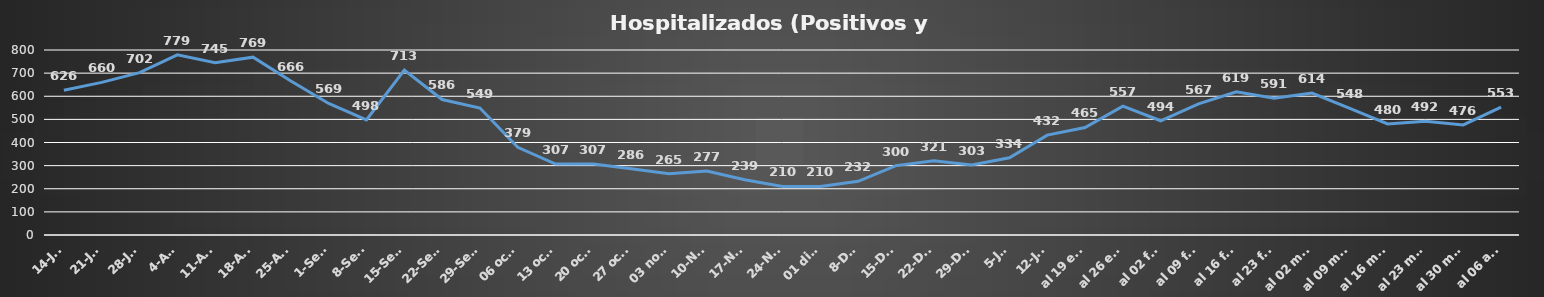
| Category | Series 0 |
|---|---|
| 14-Jul | 626 |
| 21-Jul | 660 |
| 28-Jul | 702 |
| 4-Ago | 779 |
| 11-Ago | 745 |
| 18-Ago | 769 |
| 25-Ago | 666 |
| 1-Set | 569 |
| 8-Set | 498 |
| 15-Set | 713 |
| 22-Set | 586 |
| 29-Set | 549 |
| 06 oct. | 379 |
| 13 oct. | 307 |
| 20 oct. | 307 |
| 27 oct. | 286 |
| 03 nov. | 265 |
| 10-Nov | 277 |
| 17-Nov | 239 |
| 24-Nov | 210 |
|  01 dic. | 210 |
| 8-Dic | 232 |
| 15-Dic | 300 |
| 22-Dic | 321 |
| 29-Dic | 303 |
| 5-Ene | 334 |
| 12-Ene | 432 |
| al 19 ene | 465 |
| al 26 ene | 557 |
| al 02 feb | 494 |
| al 09 feb | 567 |
| al 16 feb | 619 |
| al 23 feb | 591 |
| al 02 mar | 614 |
| al 09 mar | 548 |
| al 16 mar | 480 |
| al 23 mar | 492 |
| al 30 mar | 476 |
| al 06 abr | 553 |